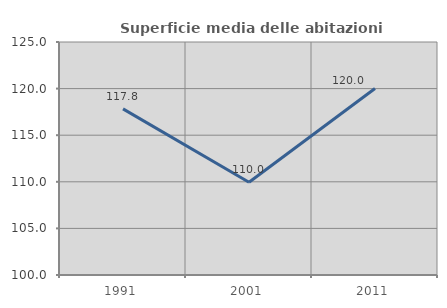
| Category | Superficie media delle abitazioni occupate |
|---|---|
| 1991.0 | 117.827 |
| 2001.0 | 109.952 |
| 2011.0 | 120.003 |